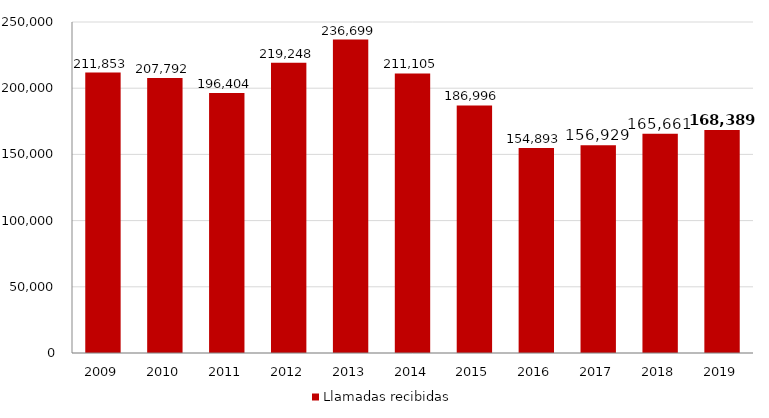
| Category | Llamadas recibidas |
|---|---|
| 2009.0 | 211853 |
| 2010.0 | 207792 |
| 2011.0 | 196404 |
| 2012.0 | 219248 |
| 2013.0 | 236699 |
| 2014.0 | 211105 |
| 2015.0 | 186996 |
| 2016.0 | 154893 |
| 2017.0 | 156929 |
| 2018.0 | 165661 |
| 2019.0 | 168389 |